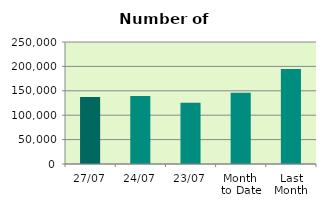
| Category | Series 0 |
|---|---|
| 27/07 | 137376 |
| 24/07 | 139320 |
| 23/07 | 125348 |
| Month 
to Date | 146055.789 |
| Last
Month | 194460.727 |